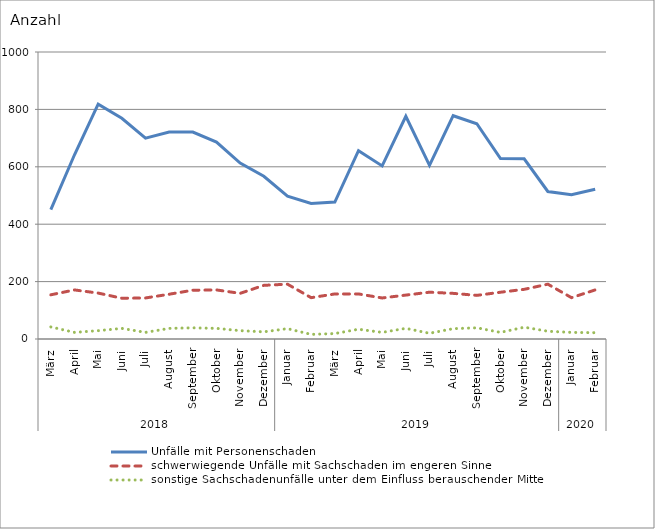
| Category | Unfälle mit Personenschaden | schwerwiegende Unfälle mit Sachschaden im engeren Sinne | sonstige Sachschadenunfälle unter dem Einfluss berauschender Mittel |
|---|---|---|---|
| 0 | 451 | 154 | 42 |
| 1 | 642 | 171 | 23 |
| 2 | 818 | 160 | 29 |
| 3 | 769 | 142 | 37 |
| 4 | 700 | 143 | 23 |
| 5 | 721 | 156 | 37 |
| 6 | 721 | 170 | 39 |
| 7 | 686 | 171 | 37 |
| 8 | 613 | 159 | 29 |
| 9 | 567 | 187 | 25 |
| 10 | 498 | 191 | 36 |
| 11 | 472 | 144 | 16 |
| 12 | 477 | 157 | 19 |
| 13 | 656 | 157 | 34 |
| 14 | 603 | 143 | 23 |
| 15 | 776 | 153 | 37 |
| 16 | 605 | 163 | 20 |
| 17 | 778 | 159 | 36 |
| 18 | 750 | 152 | 39 |
| 19 | 629 | 163 | 23 |
| 20 | 628 | 173 | 41 |
| 21 | 514 | 191 | 27 |
| 22 | 503 | 144 | 23 |
| 23 | 522 | 171 | 22 |